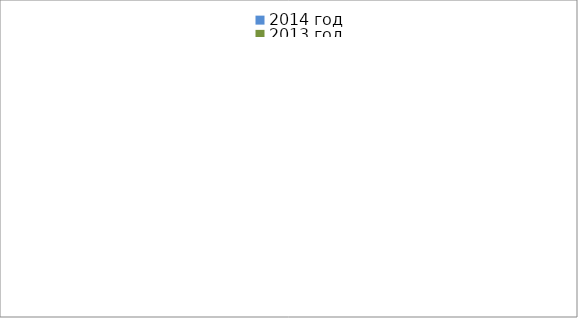
| Category | 2014 год | 2013 год |
|---|---|---|
|  - поджог | 10 | 21 |
|  - неосторожное обращение с огнём | 21 | 27 |
|  - НПТЭ электрооборудования | 12 | 18 |
|  - НПУ и Э печей | 45 | 34 |
|  - НПУ и Э транспортных средств | 43 | 43 |
|   -Шалость с огнем детей | 0 | 3 |
|  -НППБ при эксплуатации эл.приборов | 16 | 19 |
|  - курение | 11 | 9 |
| - прочие | 57 | 52 |
| - не установленные причины | 9 | 1 |